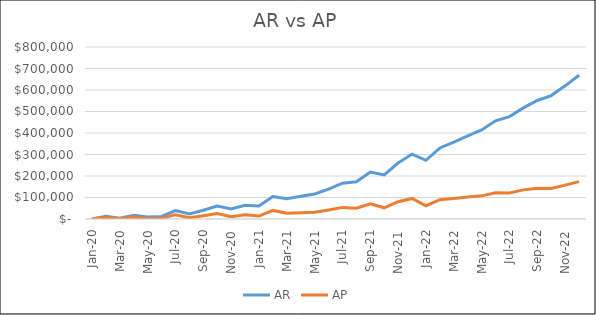
| Category | AR | AP |
|---|---|---|
| 2020-01-01 | 0 | 0 |
| 2020-02-29 | 12821.918 | 8432.877 |
| 2020-03-31 | 3945.205 | 1183.562 |
| 2020-04-30 | 17753.425 | 9764.384 |
| 2020-05-31 | 9863.014 | 2663.014 |
| 2020-06-30 | 11835.616 | 2958.904 |
| 2020-07-31 | 39452.055 | 20120.548 |
| 2020-08-31 | 23671.233 | 5917.808 |
| 2020-09-30 | 40438.356 | 14942.466 |
| 2020-10-31 | 60164.384 | 25002.74 |
| 2020-11-30 | 46356.164 | 11095.89 |
| 2020-12-31 | 64109.589 | 20268.493 |
| 2021-01-31 | 60164.384 | 13758.904 |
| 2021-02-28 | 104547.945 | 39945.205 |
| 2021-03-31 | 94684.932 | 27221.918 |
| 2021-04-30 | 105534.247 | 29441.096 |
| 2021-05-31 | 116383.562 | 31660.274 |
| 2021-06-30 | 139068.493 | 42164.384 |
| 2021-07-31 | 166684.932 | 54000 |
| 2021-08-31 | 173589.041 | 50301.37 |
| 2021-09-30 | 217972.603 | 71161.644 |
| 2021-10-31 | 205150.685 | 52076.712 |
| 2021-11-30 | 260383.562 | 80482.192 |
| 2021-12-31 | 301808.219 | 95572.603 |
| 2022-01-31 | 273205.479 | 61693.151 |
| 2022-02-28 | 330410.959 | 89802.74 |
| 2022-03-31 | 358027.397 | 95720.548 |
| 2022-04-30 | 386630.137 | 101786.301 |
| 2022-05-31 | 414246.575 | 107704.11 |
| 2022-06-30 | 456657.534 | 122350.685 |
| 2022-07-31 | 476383.562 | 121167.123 |
| 2022-08-31 | 516821.918 | 135517.808 |
| 2022-09-30 | 551342.466 | 143063.014 |
| 2022-10-31 | 574027.397 | 142323.288 |
| 2022-11-30 | 619397.26 | 157413.699 |
| 2022-12-31 | 668712.329 | 173687.671 |